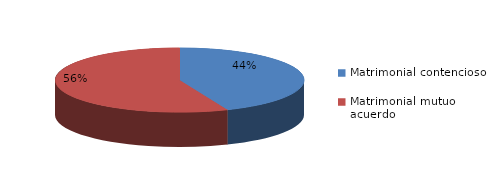
| Category | Series 0 |
|---|---|
| 0 | 748 |
| 1 | 963 |